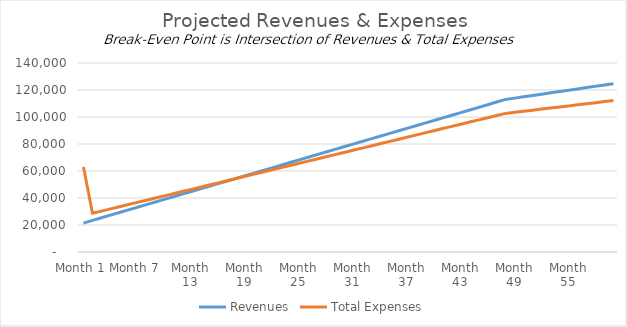
| Category | Revenues | Total Expenses |
|---|---|---|
| Month 1 | 21433.5 | 62985.099 |
| Month 2 | 23382 | 28697.496 |
| Month 3 | 25330.5 | 30307.321 |
| Month 4 | 27279 | 31917.075 |
| Month 5 | 29227.5 | 33526.755 |
| Month 6 | 31176 | 35136.363 |
| Month 7 | 33124.5 | 36745.898 |
| Month 8 | 35073 | 38355.36 |
| Month 9 | 37021.5 | 39964.748 |
| Month 10 | 38970 | 41574.061 |
| Month 11 | 40918.5 | 43183.3 |
| Month 12 | 42867 | 44792.464 |
| Month 13 | 44815.5 | 46401.552 |
| Month 14 | 46764 | 48010.565 |
| Month 15 | 48712.5 | 49619.502 |
| Month 16 | 50661 | 51228.362 |
| Month 17 | 52609.5 | 52837.146 |
| Month 18 | 54558 | 54445.852 |
| Month 19 | 56506.5 | 56054.481 |
| Month 20 | 58455 | 57663.031 |
| Month 21 | 60403.5 | 59271.503 |
| Month 22 | 62352 | 60879.897 |
| Month 23 | 64300.5 | 62488.211 |
| Month 24 | 66249 | 64096.446 |
| Month 25 | 68197.5 | 65704.601 |
| Month 26 | 70146 | 67312.675 |
| Month 27 | 72094.5 | 68920.668 |
| Month 28 | 74043 | 70528.581 |
| Month 29 | 75991.5 | 72136.412 |
| Month 30 | 77940 | 73744.16 |
| Month 31 | 79888.5 | 75351.827 |
| Month 32 | 81837 | 76959.41 |
| Month 33 | 83785.5 | 78566.911 |
| Month 34 | 85734 | 80174.327 |
| Month 35 | 87682.5 | 81781.66 |
| Month 36 | 89631 | 83388.908 |
| Month 37 | 91579.5 | 84996.071 |
| Month 38 | 93528 | 86603.149 |
| Month 39 | 95476.5 | 88210.141 |
| Month 40 | 97425 | 89817.047 |
| Month 41 | 99373.5 | 91423.867 |
| Month 42 | 101322 | 93030.599 |
| Month 43 | 103270.5 | 94637.244 |
| Month 44 | 105219 | 96243.801 |
| Month 45 | 107167.5 | 97850.269 |
| Month 46 | 109116 | 99456.649 |
| Month 47 | 111064.5 | 101062.939 |
| Month 48 | 113013 | 102669.14 |
| Month 49 | 113987.25 | 103463.136 |
| Month 50 | 114961.5 | 104257.041 |
| Month 51 | 115935.75 | 105050.855 |
| Month 52 | 116910 | 105844.578 |
| Month 53 | 117884.25 | 106638.209 |
| Month 54 | 118858.5 | 107431.747 |
| Month 55 | 119832.75 | 108225.192 |
| Month 56 | 120807 | 109018.544 |
| Month 57 | 121781.25 | 109811.802 |
| Month 58 | 122755.5 | 110604.966 |
| Month 59 | 123729.75 | 111398.035 |
| Month 60 | 124704 | 112191.009 |